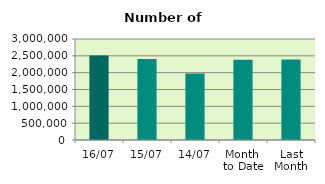
| Category | Series 0 |
|---|---|
| 16/07 | 2508900 |
| 15/07 | 2405080 |
| 14/07 | 1977304 |
| Month 
to Date | 2387236.667 |
| Last
Month | 2394428.455 |